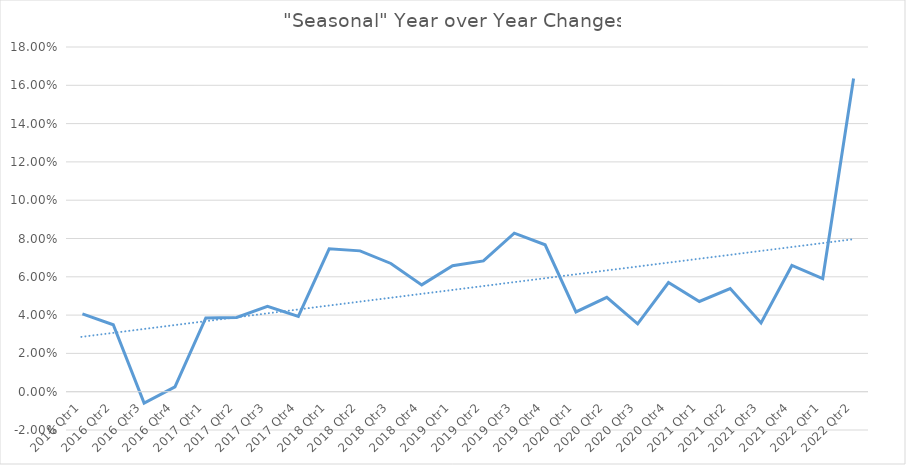
| Category | "Seasonal" Year over Year Changes |
|---|---|
| 2016 Qtr1 | 0.041 |
| 2016 Qtr2 | 0.035 |
| 2016 Qtr3 | -0.006 |
| 2016 Qtr4 | 0.002 |
| 2017 Qtr1 | 0.038 |
| 2017 Qtr2 | 0.039 |
| 2017 Qtr3 | 0.045 |
| 2017 Qtr4 | 0.039 |
| 2018 Qtr1 | 0.075 |
| 2018 Qtr2 | 0.074 |
| 2018 Qtr3 | 0.067 |
| 2018 Qtr4 | 0.056 |
| 2019 Qtr1 | 0.066 |
| 2019 Qtr2 | 0.068 |
| 2019 Qtr3 | 0.083 |
| 2019 Qtr4 | 0.077 |
| 2020 Qtr1 | 0.042 |
| 2020 Qtr2 | 0.049 |
| 2020 Qtr3 | 0.035 |
| 2020 Qtr4 | 0.057 |
| 2021 Qtr1 | 0.047 |
| 2021 Qtr2 | 0.054 |
| 2021 Qtr3 | 0.036 |
| 2021 Qtr4 | 0.066 |
| 2022 Qtr1 | 0.059 |
| 2022 Qtr2 | 0.164 |